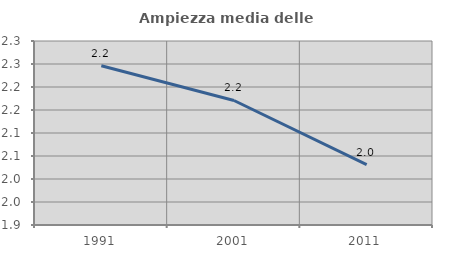
| Category | Ampiezza media delle famiglie |
|---|---|
| 1991.0 | 2.246 |
| 2001.0 | 2.171 |
| 2011.0 | 2.031 |